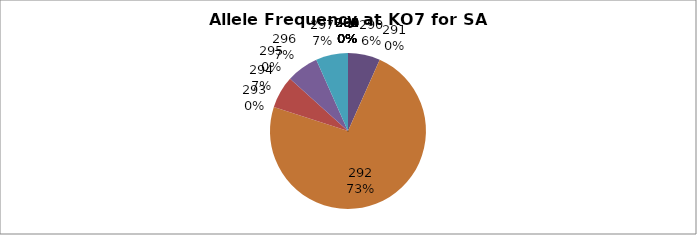
| Category | Series 0 |
|---|---|
| 260.0 | 0 |
| 285.0 | 0 |
| 289.0 | 0 |
| 290.0 | 0.067 |
| 291.0 | 0 |
| 292.0 | 0.733 |
| 293.0 | 0 |
| 294.0 | 0.067 |
| 295.0 | 0 |
| 296.0 | 0.067 |
| 297.0 | 0.067 |
| 298.0 | 0 |
| 299.0 | 0 |
| 300.0 | 0 |
| 301.0 | 0 |
| 302.0 | 0 |
| 304.0 | 0 |
| 305.0 | 0 |
| 306.0 | 0 |